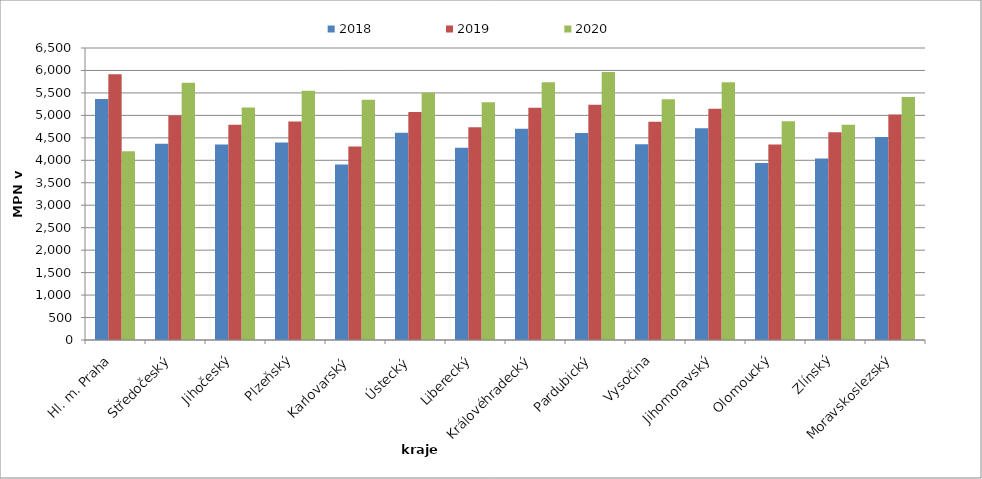
| Category | 2018 | 2019 | 2020 |
|---|---|---|---|
| Hl. m. Praha | 5364 | 5913 | 4204 |
| Středočeský | 4367 | 4999 | 5726 |
| Jihočeský | 4354 | 4790 | 5176 |
| Plzeňský | 4395 | 4864 | 5548 |
| Karlovarský  | 3906 | 4308 | 5350 |
| Ústecký   | 4613 | 5074 | 5505 |
| Liberecký | 4282 | 4736 | 5295 |
| Královéhradecký | 4700 | 5170 | 5739 |
| Pardubický | 4609 | 5234 | 5966 |
| Vysočina | 4356 | 4857 | 5359 |
| Jihomoravský | 4712 | 5146 | 5739 |
| Olomoucký | 3940 | 4354 | 4869 |
| Zlínský | 4040 | 4624 | 4792 |
| Moravskoslezský | 4520 | 5018 | 5407 |